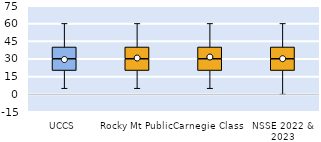
| Category | 25th | 50th | 75th |
|---|---|---|---|
| UCCS | 20 | 10 | 10 |
| Rocky Mt Public | 20 | 10 | 10 |
| Carnegie Class | 20 | 10 | 10 |
| NSSE 2022 & 2023 | 20 | 10 | 10 |